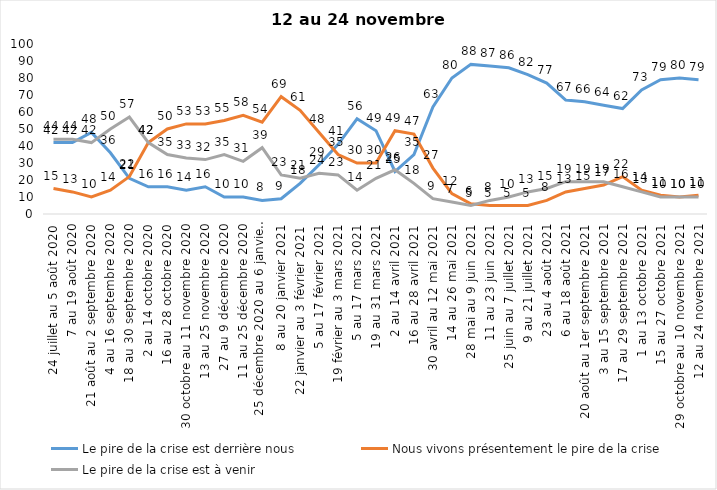
| Category | Le pire de la crise est derrière nous | Nous vivons présentement le pire de la crise | Le pire de la crise est à venir |
|---|---|---|---|
| 24 juillet au 5 août 2020 | 42 | 15 | 44 |
| 7 au 19 août 2020 | 42 | 13 | 44 |
| 21 août au 2 septembre 2020 | 48 | 10 | 42 |
| 4 au 16 septembre 2020 | 36 | 14 | 50 |
| 18 au 30 septembre 2020 | 21 | 22 | 57 |
| 2 au 14 octobre 2020 | 16 | 42 | 42 |
| 16 au 28 octobre 2020 | 16 | 50 | 35 |
| 30 octobre au 11 novembre 2020 | 14 | 53 | 33 |
| 13 au 25 novembre 2020 | 16 | 53 | 32 |
| 27 au 9 décembre 2020 | 10 | 55 | 35 |
| 11 au 25 décembre 2020 | 10 | 58 | 31 |
| 25 décembre 2020 au 6 janvier 2021 | 8 | 54 | 39 |
| 8 au 20 janvier 2021 | 9 | 69 | 23 |
| 22 janvier au 3 février 2021 | 18 | 61 | 21 |
| 5 au 17 février 2021 | 29 | 48 | 24 |
| 19 février au 3 mars 2021 | 41 | 35 | 23 |
| 5 au 17 mars 2021 | 56 | 30 | 14 |
| 19 au 31 mars 2021 | 49 | 30 | 21 |
| 2 au 14 avril 2021 | 25 | 49 | 26 |
| 16 au 28 avril 2021 | 35 | 47 | 18 |
| 30 avril au 12 mai 2021 | 63 | 27 | 9 |
| 14 au 26 mai 2021 | 80 | 12 | 7 |
| 28 mai au 9 juin 2021 | 88 | 6 | 5 |
| 11 au 23 juin 2021 | 87 | 5 | 8 |
| 25 juin au 7 juillet 2021 | 86 | 5 | 10 |
| 9 au 21 juillet 2021 | 82 | 5 | 13 |
| 23 au 4 août 2021 | 77 | 8 | 15 |
| 6 au 18 août 2021 | 67 | 13 | 19 |
| 20 août au 1er septembre 2021 | 66 | 15 | 19 |
| 3 au 15 septembre 2021 | 64 | 17 | 19 |
| 17 au 29 septembre 2021 | 62 | 22 | 16 |
| 1 au 13 octobre 2021 | 73 | 14 | 13 |
| 15 au 27 octobre 2021 | 79 | 11 | 10 |
| 29 octobre au 10 novembre 2021 | 80 | 10 | 10 |
| 12 au 24 novembre 2021 | 79 | 11 | 10 |